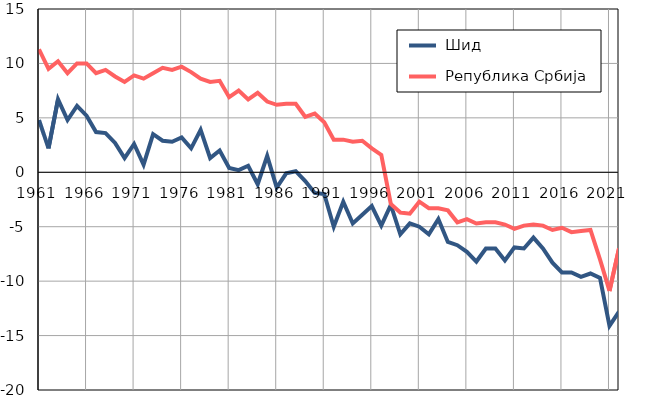
| Category |  Шид |  Република Србија |
|---|---|---|
| 1961.0 | 4.8 | 11.3 |
| 1962.0 | 2.2 | 9.5 |
| 1963.0 | 6.7 | 10.2 |
| 1964.0 | 4.8 | 9.1 |
| 1965.0 | 6.1 | 10 |
| 1966.0 | 5.2 | 10 |
| 1967.0 | 3.7 | 9.1 |
| 1968.0 | 3.6 | 9.4 |
| 1969.0 | 2.7 | 8.8 |
| 1970.0 | 1.3 | 8.3 |
| 1971.0 | 2.6 | 8.9 |
| 1972.0 | 0.7 | 8.6 |
| 1973.0 | 3.5 | 9.1 |
| 1974.0 | 2.9 | 9.6 |
| 1975.0 | 2.8 | 9.4 |
| 1976.0 | 3.2 | 9.7 |
| 1977.0 | 2.2 | 9.2 |
| 1978.0 | 3.9 | 8.6 |
| 1979.0 | 1.3 | 8.3 |
| 1980.0 | 2 | 8.4 |
| 1981.0 | 0.4 | 6.9 |
| 1982.0 | 0.2 | 7.5 |
| 1983.0 | 0.6 | 6.7 |
| 1984.0 | -1.1 | 7.3 |
| 1985.0 | 1.5 | 6.5 |
| 1986.0 | -1.4 | 6.2 |
| 1987.0 | -0.1 | 6.3 |
| 1988.0 | 0.1 | 6.3 |
| 1989.0 | -0.8 | 5.1 |
| 1990.0 | -1.9 | 5.4 |
| 1991.0 | -2 | 4.6 |
| 1992.0 | -5 | 3 |
| 1993.0 | -2.7 | 3 |
| 1994.0 | -4.7 | 2.8 |
| 1995.0 | -3.9 | 2.9 |
| 1996.0 | -3.1 | 2.2 |
| 1997.0 | -4.9 | 1.6 |
| 1998.0 | -3 | -2.9 |
| 1999.0 | -5.7 | -3.7 |
| 2000.0 | -4.7 | -3.8 |
| 2001.0 | -5 | -2.7 |
| 2002.0 | -5.7 | -3.3 |
| 2003.0 | -4.3 | -3.3 |
| 2004.0 | -6.4 | -3.5 |
| 2005.0 | -6.7 | -4.6 |
| 2006.0 | -7.3 | -4.3 |
| 2007.0 | -8.2 | -4.7 |
| 2008.0 | -7 | -4.6 |
| 2009.0 | -7 | -4.6 |
| 2010.0 | -8.1 | -4.8 |
| 2011.0 | -6.9 | -5.2 |
| 2012.0 | -7 | -4.9 |
| 2013.0 | -6 | -4.8 |
| 2014.0 | -7 | -4.9 |
| 2015.0 | -8.3 | -5.3 |
| 2016.0 | -9.2 | -5.1 |
| 2017.0 | -9.2 | -5.5 |
| 2018.0 | -9.6 | -5.4 |
| 2019.0 | -9.3 | -5.3 |
| 2020.0 | -9.7 | -8 |
| 2021.0 | -14.1 | -10.9 |
| 2022.0 | -12.8 | -7 |